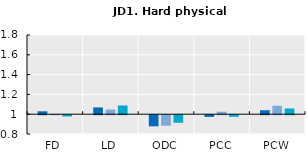
| Category | 2005 | 2010 | 2015 |
|---|---|---|---|
| FD | 1.029 | 1.002 | 0.987 |
| LD | 1.068 | 1.047 | 1.088 |
| ODC | 0.888 | 0.893 | 0.923 |
| PCC | 0.983 | 1.025 | 0.984 |
| PCW | 1.04 | 1.086 | 1.058 |